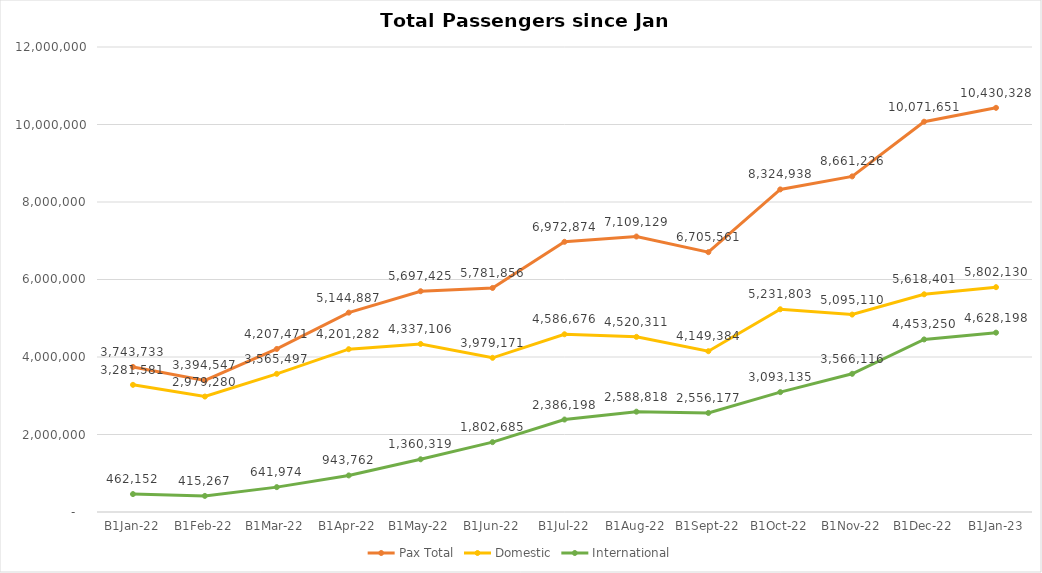
| Category | Pax Total |  Domestic  |  International  |
|---|---|---|---|
| 2022-01-01 | 3743733 | 3281581 | 462152 |
| 2022-02-01 | 3394547 | 2979280 | 415267 |
| 2022-03-01 | 4207471 | 3565497 | 641974 |
| 2022-04-01 | 5144887 | 4201282 | 943762 |
| 2022-05-01 | 5697425 | 4337106 | 1360319 |
| 2022-06-01 | 5781856 | 3979171 | 1802685 |
| 2022-07-01 | 6972874 | 4586676 | 2386198 |
| 2022-08-01 | 7109129 | 4520311 | 2588818 |
| 2022-09-01 | 6705561 | 4149384 | 2556177 |
| 2022-10-01 | 8324938 | 5231803 | 3093135 |
| 2022-11-01 | 8661226 | 5095110 | 3566116 |
| 2022-12-01 | 10071651 | 5618401 | 4453250 |
| 2023-01-01 | 10430328 | 5802130 | 4628198 |